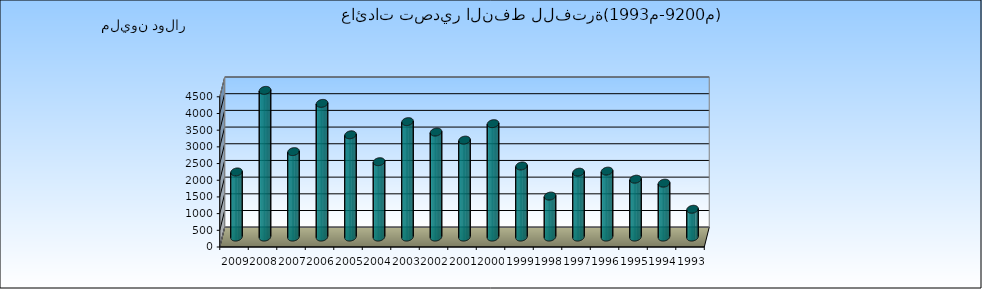
| Category | عائدات التصدير من العملة الصعبة  |
|---|---|
| 1993.0 | 833.6 |
| 1994.0 | 1615.4 |
| 1995.0 | 1735 |
| 1996.0 | 1976.1 |
| 1997.0 | 1944.9 |
| 1998.0 | 1228.7 |
| 1999.0 | 2131.2 |
| 2000.0 | 3398.8 |
| 2001.0 | 2905.1 |
| 2002.0 | 3146.6 |
| 2003.0 | 3459.1 |
| 2004.0 | 2259.17 |
| 2005.0 | 3065.07 |
| 2006.0 | 4006 |
| 2007.0 | 2561 |
| 2008.0 | 4396 |
| 2009.0 | 1952 |